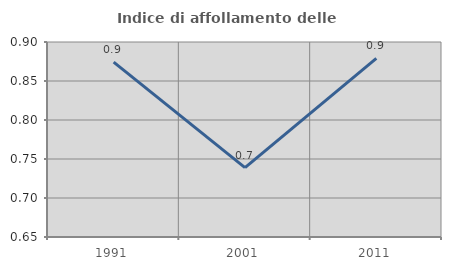
| Category | Indice di affollamento delle abitazioni  |
|---|---|
| 1991.0 | 0.874 |
| 2001.0 | 0.739 |
| 2011.0 | 0.879 |